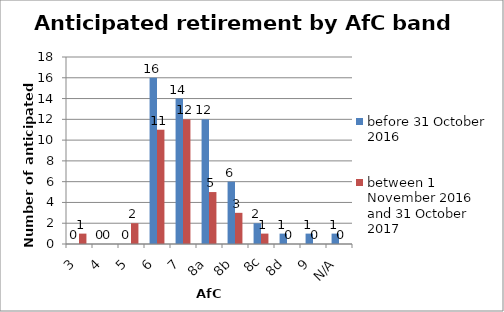
| Category | before 31 October 2016 | between 1 November 2016 and 31 October 2017 |
|---|---|---|
| 3 | 0 | 1 |
| 4 | 0 | 0 |
| 5 | 0 | 2 |
| 6 | 16 | 11 |
| 7 | 14 | 12 |
| 8a | 12 | 5 |
| 8b | 6 | 3 |
| 8c | 2 | 1 |
| 8d | 1 | 0 |
| 9 | 1 | 0 |
| N/A | 1 | 0 |